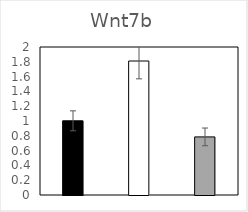
| Category | Wnt7b |
|---|---|
| Scr+Ctr | 1.003 |
| KD023 | 1.811 |
| KD023+ siWnt7b | 0.785 |